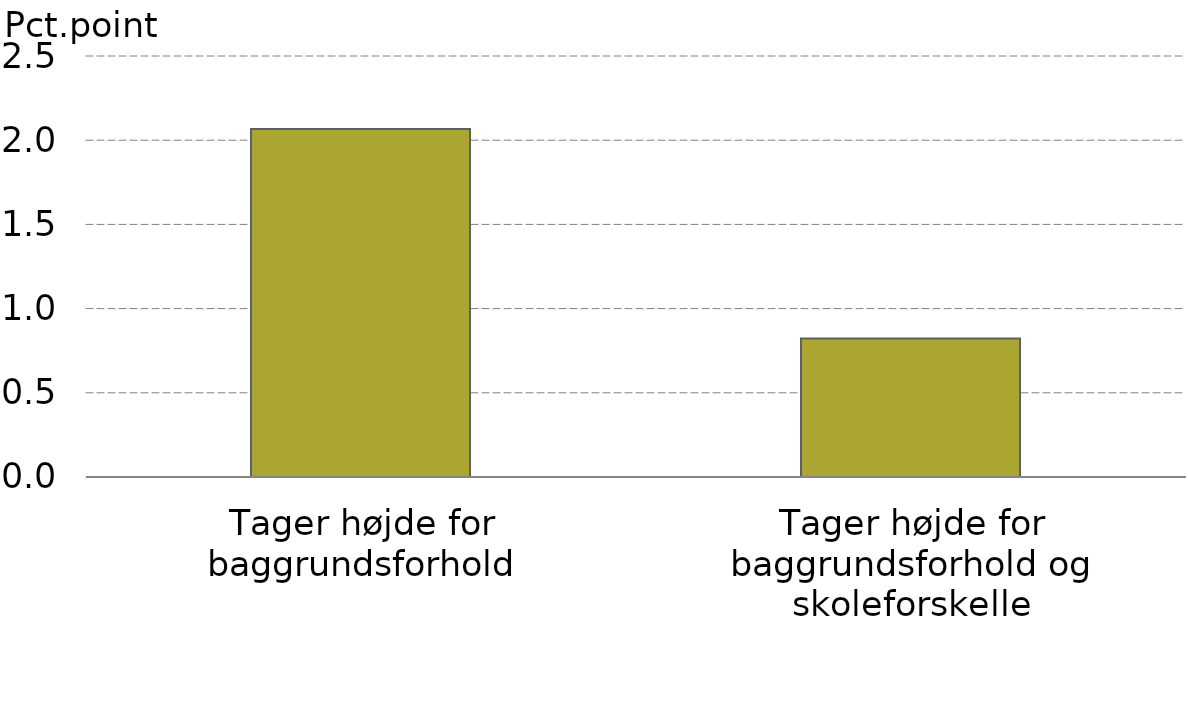
| Category |  Serie1 |
|---|---|
| Tager højde for baggrundsforhold | 2.067 |
| Tager højde for baggrundsforhold og skoleforskelle | 0.822 |